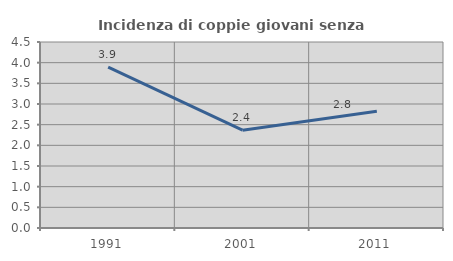
| Category | Incidenza di coppie giovani senza figli |
|---|---|
| 1991.0 | 3.894 |
| 2001.0 | 2.367 |
| 2011.0 | 2.824 |